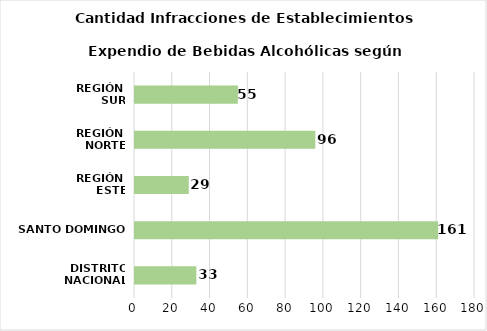
| Category | Series 0 |
|---|---|
| DISTRITO NACIONAL | 33 |
| SANTO DOMINGO | 161 |
| REGIÓN 
ESTE | 29 |
| REGIÓN 
NORTE | 96 |
| REGIÓN 
SUR | 55 |